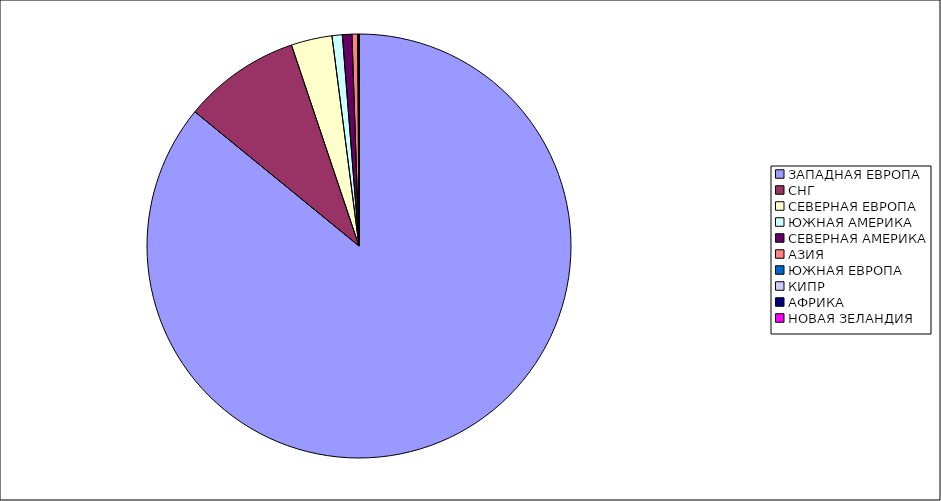
| Category | Оборот |
|---|---|
| ЗАПАДНАЯ ЕВРОПА | 0.859 |
| СНГ | 0.089 |
| СЕВЕРНАЯ ЕВРОПА | 0.031 |
| ЮЖНАЯ АМЕРИКА | 0.008 |
| СЕВЕРНАЯ АМЕРИКА | 0.007 |
| АЗИЯ | 0.004 |
| ЮЖНАЯ ЕВРОПА | 0.001 |
| КИПР | 0 |
| АФРИКА | 0 |
| НОВАЯ ЗЕЛАНДИЯ | 0 |